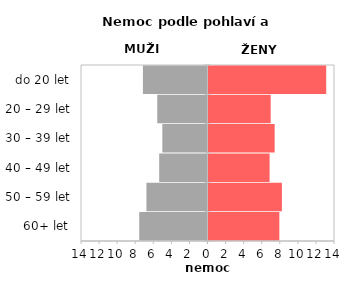
| Category | Nemoc |
|---|---|
| 60+ let | 7.84 |
| 50 – 59 let | 8.12 |
| 40 – 49 let | 6.763 |
| 30 – 39 let | 7.32 |
| 20 – 29 let | 6.883 |
| do 20 let | 13.027 |